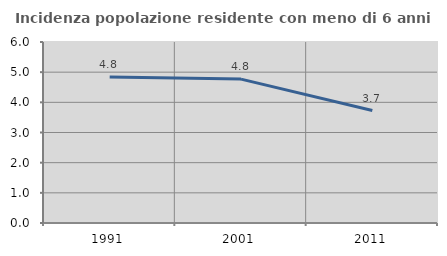
| Category | Incidenza popolazione residente con meno di 6 anni |
|---|---|
| 1991.0 | 4.837 |
| 2001.0 | 4.77 |
| 2011.0 | 3.727 |